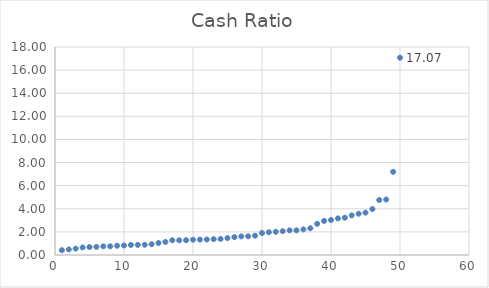
| Category | Series 0 |
|---|---|
| 0 | 0.421 |
| 1 | 0.483 |
| 2 | 0.551 |
| 3 | 0.654 |
| 4 | 0.689 |
| 5 | 0.706 |
| 6 | 0.749 |
| 7 | 0.751 |
| 8 | 0.8 |
| 9 | 0.824 |
| 10 | 0.872 |
| 11 | 0.877 |
| 12 | 0.886 |
| 13 | 0.934 |
| 14 | 1.039 |
| 15 | 1.131 |
| 16 | 1.273 |
| 17 | 1.274 |
| 18 | 1.282 |
| 19 | 1.321 |
| 20 | 1.331 |
| 21 | 1.342 |
| 22 | 1.37 |
| 23 | 1.391 |
| 24 | 1.463 |
| 25 | 1.546 |
| 26 | 1.609 |
| 27 | 1.62 |
| 28 | 1.669 |
| 29 | 1.902 |
| 30 | 1.969 |
| 31 | 2.008 |
| 32 | 2.064 |
| 33 | 2.133 |
| 34 | 2.135 |
| 35 | 2.216 |
| 36 | 2.317 |
| 37 | 2.697 |
| 38 | 2.948 |
| 39 | 3.029 |
| 40 | 3.167 |
| 41 | 3.228 |
| 42 | 3.431 |
| 43 | 3.57 |
| 44 | 3.664 |
| 45 | 3.975 |
| 46 | 4.758 |
| 47 | 4.803 |
| 48 | 7.199 |
| 49 | 17.073 |